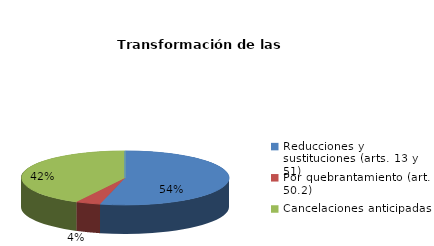
| Category | Series 0 |
|---|---|
| Reducciones y sustituciones (arts. 13 y 51) | 14 |
| Por quebrantamiento (art. 50.2) | 1 |
| Cancelaciones anticipadas | 11 |
| Traslado a Centros Penitenciarios | 0 |
| Conversión internamientos en cerrados (art. 51.2) | 0 |